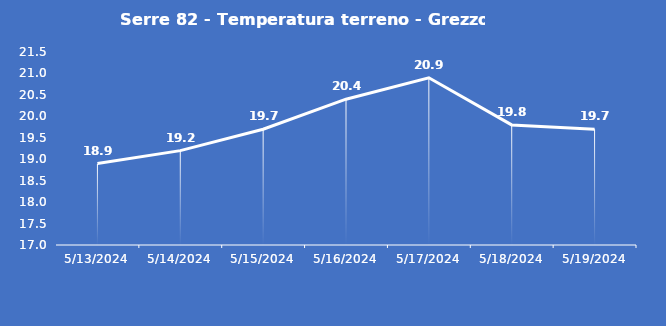
| Category | Serre 82 - Temperatura terreno - Grezzo (°C) |
|---|---|
| 5/13/24 | 18.9 |
| 5/14/24 | 19.2 |
| 5/15/24 | 19.7 |
| 5/16/24 | 20.4 |
| 5/17/24 | 20.9 |
| 5/18/24 | 19.8 |
| 5/19/24 | 19.7 |